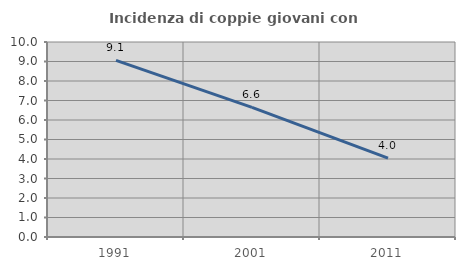
| Category | Incidenza di coppie giovani con figli |
|---|---|
| 1991.0 | 9.06 |
| 2001.0 | 6.645 |
| 2011.0 | 4.044 |